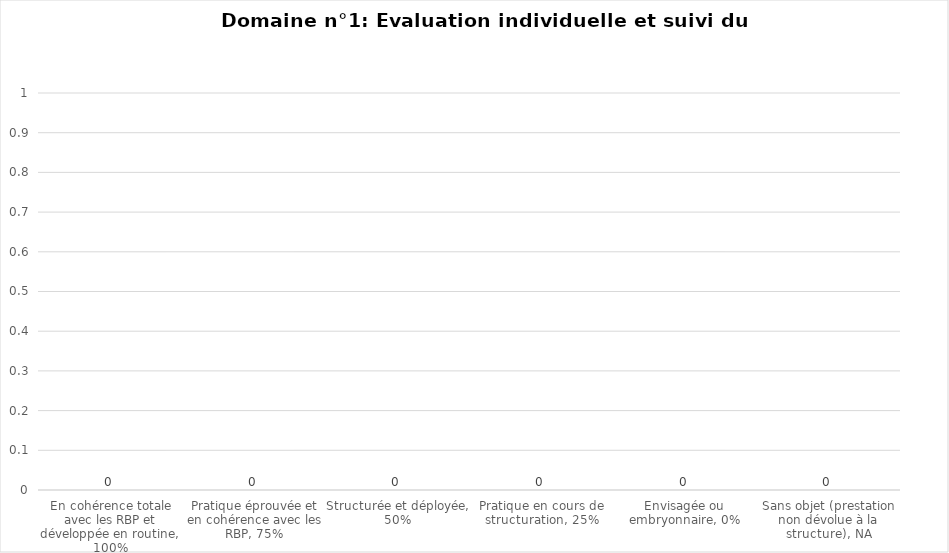
| Category | Domaine n°1: Evaluation individuelle et suivi du développement |
|---|---|
| En cohérence totale avec les RBP et développée en routine, 100% | 0 |
| Pratique éprouvée et en cohérence avec les RBP, 75% | 0 |
| Structurée et déployée, 50% | 0 |
| Pratique en cours de structuration, 25% | 0 |
| Envisagée ou embryonnaire, 0% | 0 |
| Sans objet (prestation non dévolue à la structure), NA | 0 |